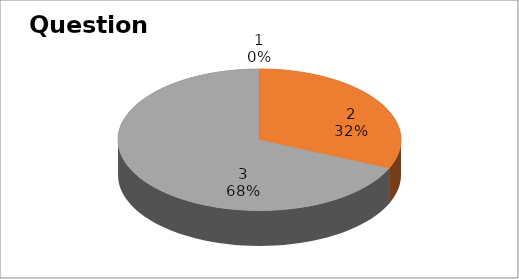
| Category | Series 0 |
|---|---|
| 0 | 0 |
| 1 | 6 |
| 2 | 13 |